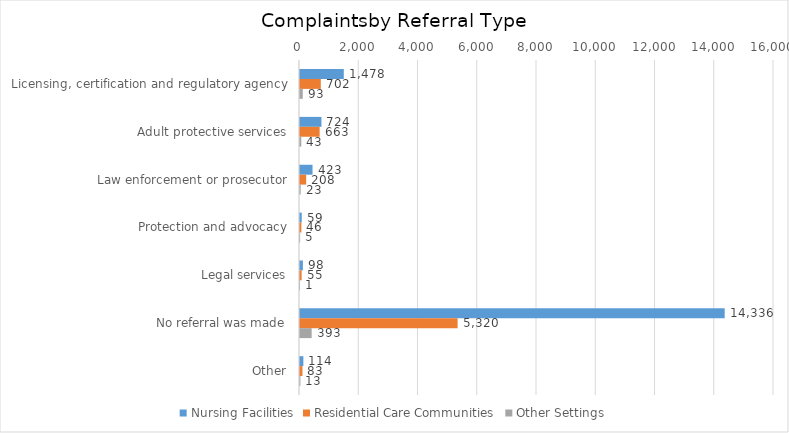
| Category | Nursing Facilities | Residential Care Communities | Other Settings |
|---|---|---|---|
| Licensing, certification and regulatory agency | 1478 | 702 | 93 |
| Adult protective services | 724 | 663 | 43 |
| Law enforcement or prosecutor | 423 | 208 | 23 |
| Protection and advocacy | 59 | 46 | 5 |
| Legal services | 98 | 55 | 1 |
| No referral was made | 14336 | 5320 | 393 |
| Other | 114 | 83 | 13 |